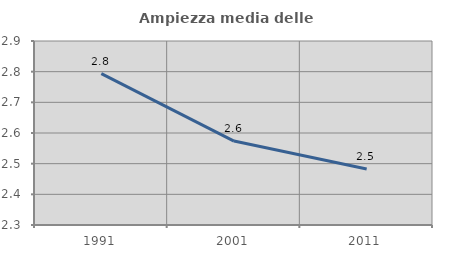
| Category | Ampiezza media delle famiglie |
|---|---|
| 1991.0 | 2.793 |
| 2001.0 | 2.574 |
| 2011.0 | 2.483 |